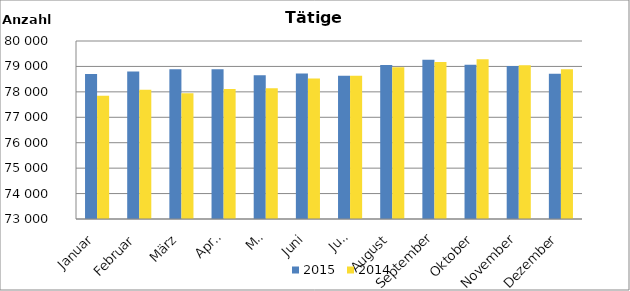
| Category | 2015 | 2014 |
|---|---|---|
| Januar | 78707 | 77842 |
| Februar | 78803 | 78083 |
| März | 78886 | 77945 |
| April | 78891 | 78108 |
| Mai | 78656 | 78137 |
| Juni | 78717 | 78529 |
| Juli | 78630 | 78631 |
| August | 79059 | 78964 |
| September | 79265 | 79170 |
| Oktober | 79069 | 79278 |
| November | 79021 | 79047 |
| Dezember | 78712 | 78892 |